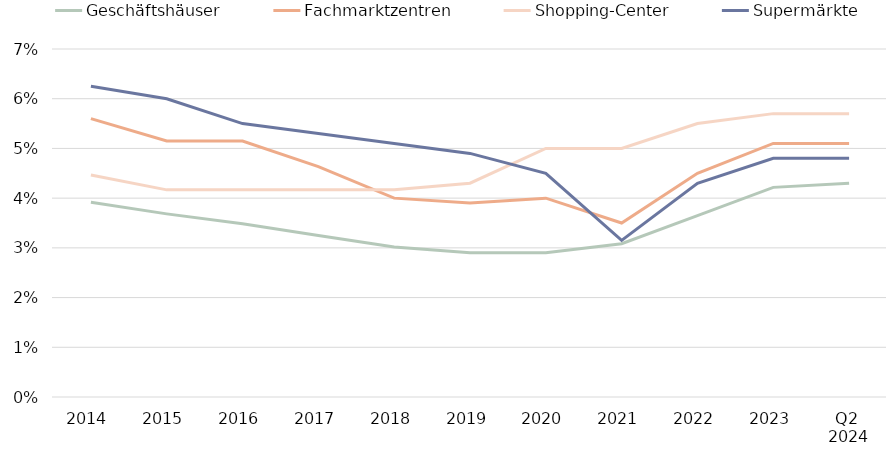
| Category | Geschäftshäuser | Fachmarktzentren | Shopping-Center | Supermärkte |
|---|---|---|---|---|
| 2014 | 0.039 | 0.056 | 0.045 | 0.062 |
| 2015 | 0.037 | 0.052 | 0.042 | 0.06 |
| 2016 | 0.035 | 0.052 | 0.042 | 0.055 |
| 2017 | 0.032 | 0.046 | 0.042 | 0.053 |
| 2018 | 0.03 | 0.04 | 0.042 | 0.051 |
| 2019 | 0.029 | 0.039 | 0.043 | 0.049 |
| 2020 | 0.029 | 0.04 | 0.05 | 0.045 |
| 2021 | 0.031 | 0.035 | 0.05 | 0.032 |
| 2022 | 0.037 | 0.045 | 0.055 | 0.043 |
| 2023 | 0.042 | 0.051 | 0.057 | 0.048 |
| Q2 
2024 | 0.043 | 0.051 | 0.057 | 0.048 |